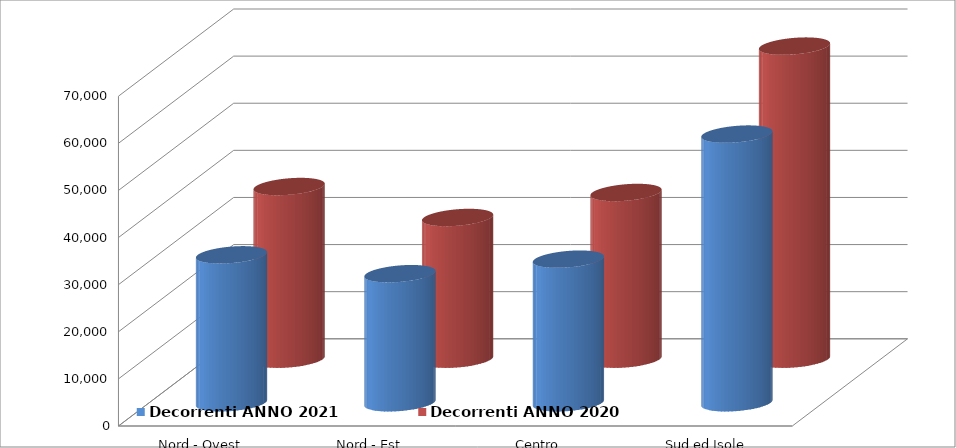
| Category | Decorrenti ANNO 2021 | Decorrenti ANNO 2020 |
|---|---|---|
| Nord - Ovest | 31408 | 36649 |
| Nord - Est | 27409 | 30079 |
| Centro | 30489 | 35387 |
| Sud ed Isole | 57037 | 66457 |